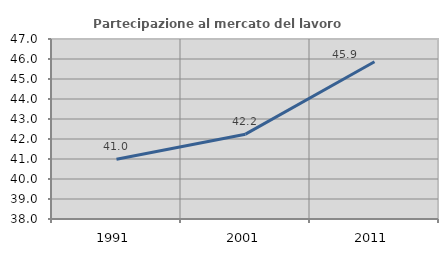
| Category | Partecipazione al mercato del lavoro  femminile |
|---|---|
| 1991.0 | 40.988 |
| 2001.0 | 42.241 |
| 2011.0 | 45.86 |